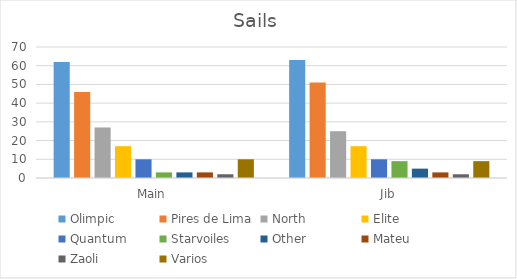
| Category | Olimpic | Pires de Lima | North | Elite | Quantum | Starvoiles | Other | Mateu | Zaoli | Varios |
|---|---|---|---|---|---|---|---|---|---|---|
| Main | 62 | 46 | 27 | 17 | 10 | 3 | 3 | 3 | 2 | 10 |
| Jib | 63 | 51 | 25 | 17 | 10 | 9 | 5 | 3 | 2 | 9 |